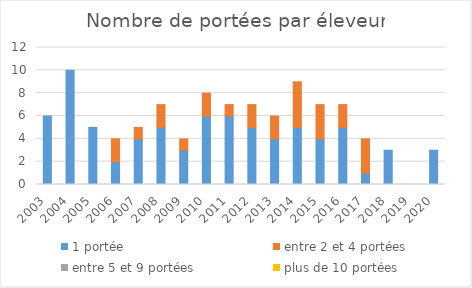
| Category | 1 portée | entre 2 et 4 portées | entre 5 et 9 portées | plus de 10 portées |
|---|---|---|---|---|
| 2003.0 | 6 | 0 | 0 | 0 |
| 2004.0 | 10 | 0 | 0 | 0 |
| 2005.0 | 5 | 0 | 0 | 0 |
| 2006.0 | 2 | 2 | 0 | 0 |
| 2007.0 | 4 | 1 | 0 | 0 |
| 2008.0 | 5 | 2 | 0 | 0 |
| 2009.0 | 3 | 1 | 0 | 0 |
| 2010.0 | 6 | 2 | 0 | 0 |
| 2011.0 | 6 | 1 | 0 | 0 |
| 2012.0 | 5 | 2 | 0 | 0 |
| 2013.0 | 4 | 2 | 0 | 0 |
| 2014.0 | 5 | 4 | 0 | 0 |
| 2015.0 | 4 | 3 | 0 | 0 |
| 2016.0 | 5 | 2 | 0 | 0 |
| 2017.0 | 1 | 3 | 0 | 0 |
| 2018.0 | 3 | 0 | 0 | 0 |
| 2019.0 | 0 | 0 | 0 | 0 |
| 2020.0 | 3 | 0 | 0 | 0 |